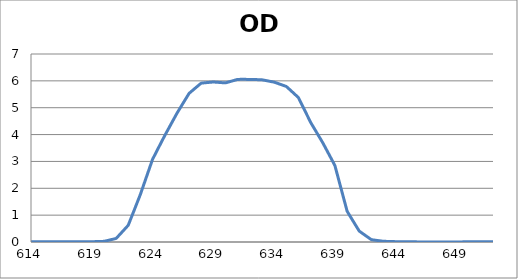
| Category | Series 0 |
|---|---|
| 2600.0 | 0.269 |
| 2599.0 | 0.268 |
| 2598.0 | 0.267 |
| 2597.0 | 0.266 |
| 2596.0 | 0.264 |
| 2595.0 | 0.263 |
| 2594.0 | 0.261 |
| 2593.0 | 0.259 |
| 2592.0 | 0.257 |
| 2591.0 | 0.255 |
| 2590.0 | 0.253 |
| 2589.0 | 0.251 |
| 2588.0 | 0.249 |
| 2587.0 | 0.247 |
| 2586.0 | 0.246 |
| 2585.0 | 0.244 |
| 2584.0 | 0.243 |
| 2583.0 | 0.242 |
| 2582.0 | 0.241 |
| 2581.0 | 0.24 |
| 2580.0 | 0.239 |
| 2579.0 | 0.238 |
| 2578.0 | 0.238 |
| 2577.0 | 0.237 |
| 2576.0 | 0.237 |
| 2575.0 | 0.237 |
| 2574.0 | 0.236 |
| 2573.0 | 0.236 |
| 2572.0 | 0.237 |
| 2571.0 | 0.237 |
| 2570.0 | 0.237 |
| 2569.0 | 0.238 |
| 2568.0 | 0.238 |
| 2567.0 | 0.238 |
| 2566.0 | 0.239 |
| 2565.0 | 0.239 |
| 2564.0 | 0.239 |
| 2563.0 | 0.24 |
| 2562.0 | 0.24 |
| 2561.0 | 0.24 |
| 2560.0 | 0.24 |
| 2559.0 | 0.24 |
| 2558.0 | 0.24 |
| 2557.0 | 0.239 |
| 2556.0 | 0.238 |
| 2555.0 | 0.237 |
| 2554.0 | 0.236 |
| 2553.0 | 0.235 |
| 2552.0 | 0.233 |
| 2551.0 | 0.231 |
| 2550.0 | 0.229 |
| 2549.0 | 0.226 |
| 2548.0 | 0.223 |
| 2547.0 | 0.22 |
| 2546.0 | 0.217 |
| 2545.0 | 0.213 |
| 2544.0 | 0.21 |
| 2543.0 | 0.206 |
| 2542.0 | 0.203 |
| 2541.0 | 0.2 |
| 2540.0 | 0.196 |
| 2539.0 | 0.192 |
| 2538.0 | 0.189 |
| 2537.0 | 0.185 |
| 2536.0 | 0.182 |
| 2535.0 | 0.179 |
| 2534.0 | 0.175 |
| 2533.0 | 0.172 |
| 2532.0 | 0.169 |
| 2531.0 | 0.167 |
| 2530.0 | 0.164 |
| 2529.0 | 0.163 |
| 2528.0 | 0.161 |
| 2527.0 | 0.16 |
| 2526.0 | 0.159 |
| 2525.0 | 0.159 |
| 2524.0 | 0.159 |
| 2523.0 | 0.16 |
| 2522.0 | 0.161 |
| 2521.0 | 0.162 |
| 2520.0 | 0.164 |
| 2519.0 | 0.166 |
| 2518.0 | 0.168 |
| 2517.0 | 0.171 |
| 2516.0 | 0.174 |
| 2515.0 | 0.178 |
| 2514.0 | 0.181 |
| 2513.0 | 0.185 |
| 2512.0 | 0.189 |
| 2511.0 | 0.192 |
| 2510.0 | 0.196 |
| 2509.0 | 0.2 |
| 2508.0 | 0.204 |
| 2507.0 | 0.207 |
| 2506.0 | 0.211 |
| 2505.0 | 0.214 |
| 2504.0 | 0.217 |
| 2503.0 | 0.22 |
| 2502.0 | 0.222 |
| 2501.0 | 0.224 |
| 2500.0 | 0.226 |
| 2499.0 | 0.227 |
| 2498.0 | 0.228 |
| 2497.0 | 0.228 |
| 2496.0 | 0.228 |
| 2495.0 | 0.227 |
| 2494.0 | 0.226 |
| 2493.0 | 0.225 |
| 2492.0 | 0.223 |
| 2491.0 | 0.221 |
| 2490.0 | 0.219 |
| 2489.0 | 0.216 |
| 2488.0 | 0.212 |
| 2487.0 | 0.209 |
| 2486.0 | 0.205 |
| 2485.0 | 0.201 |
| 2484.0 | 0.197 |
| 2483.0 | 0.192 |
| 2482.0 | 0.187 |
| 2481.0 | 0.183 |
| 2480.0 | 0.178 |
| 2479.0 | 0.173 |
| 2478.0 | 0.169 |
| 2477.0 | 0.165 |
| 2476.0 | 0.16 |
| 2475.0 | 0.156 |
| 2474.0 | 0.153 |
| 2473.0 | 0.149 |
| 2472.0 | 0.146 |
| 2471.0 | 0.143 |
| 2470.0 | 0.141 |
| 2469.0 | 0.14 |
| 2468.0 | 0.139 |
| 2467.0 | 0.138 |
| 2466.0 | 0.138 |
| 2465.0 | 0.138 |
| 2464.0 | 0.139 |
| 2463.0 | 0.14 |
| 2462.0 | 0.142 |
| 2461.0 | 0.143 |
| 2460.0 | 0.146 |
| 2459.0 | 0.148 |
| 2458.0 | 0.151 |
| 2457.0 | 0.153 |
| 2456.0 | 0.156 |
| 2455.0 | 0.159 |
| 2454.0 | 0.162 |
| 2453.0 | 0.165 |
| 2452.0 | 0.168 |
| 2451.0 | 0.17 |
| 2450.0 | 0.172 |
| 2449.0 | 0.175 |
| 2448.0 | 0.177 |
| 2447.0 | 0.178 |
| 2446.0 | 0.18 |
| 2445.0 | 0.18 |
| 2444.0 | 0.181 |
| 2443.0 | 0.181 |
| 2442.0 | 0.181 |
| 2441.0 | 0.18 |
| 2440.0 | 0.179 |
| 2439.0 | 0.178 |
| 2438.0 | 0.176 |
| 2437.0 | 0.174 |
| 2436.0 | 0.172 |
| 2435.0 | 0.169 |
| 2434.0 | 0.166 |
| 2433.0 | 0.163 |
| 2432.0 | 0.16 |
| 2431.0 | 0.156 |
| 2430.0 | 0.153 |
| 2429.0 | 0.149 |
| 2428.0 | 0.146 |
| 2427.0 | 0.142 |
| 2426.0 | 0.139 |
| 2425.0 | 0.136 |
| 2424.0 | 0.133 |
| 2423.0 | 0.131 |
| 2422.0 | 0.129 |
| 2421.0 | 0.127 |
| 2420.0 | 0.126 |
| 2419.0 | 0.125 |
| 2418.0 | 0.124 |
| 2417.0 | 0.124 |
| 2416.0 | 0.125 |
| 2415.0 | 0.126 |
| 2414.0 | 0.128 |
| 2413.0 | 0.129 |
| 2412.0 | 0.131 |
| 2411.0 | 0.133 |
| 2410.0 | 0.136 |
| 2409.0 | 0.139 |
| 2408.0 | 0.142 |
| 2407.0 | 0.145 |
| 2406.0 | 0.149 |
| 2405.0 | 0.152 |
| 2404.0 | 0.155 |
| 2403.0 | 0.159 |
| 2402.0 | 0.162 |
| 2401.0 | 0.165 |
| 2400.0 | 0.168 |
| 2399.0 | 0.171 |
| 2398.0 | 0.173 |
| 2397.0 | 0.175 |
| 2396.0 | 0.177 |
| 2395.0 | 0.178 |
| 2394.0 | 0.18 |
| 2393.0 | 0.18 |
| 2392.0 | 0.181 |
| 2391.0 | 0.18 |
| 2390.0 | 0.18 |
| 2389.0 | 0.18 |
| 2388.0 | 0.179 |
| 2387.0 | 0.178 |
| 2386.0 | 0.177 |
| 2385.0 | 0.175 |
| 2384.0 | 0.173 |
| 2383.0 | 0.172 |
| 2382.0 | 0.17 |
| 2381.0 | 0.169 |
| 2380.0 | 0.167 |
| 2379.0 | 0.166 |
| 2378.0 | 0.165 |
| 2377.0 | 0.164 |
| 2376.0 | 0.164 |
| 2375.0 | 0.164 |
| 2374.0 | 0.164 |
| 2373.0 | 0.165 |
| 2372.0 | 0.166 |
| 2371.0 | 0.168 |
| 2370.0 | 0.17 |
| 2369.0 | 0.173 |
| 2368.0 | 0.176 |
| 2367.0 | 0.179 |
| 2366.0 | 0.183 |
| 2365.0 | 0.188 |
| 2364.0 | 0.192 |
| 2363.0 | 0.197 |
| 2362.0 | 0.203 |
| 2361.0 | 0.208 |
| 2360.0 | 0.213 |
| 2359.0 | 0.219 |
| 2358.0 | 0.224 |
| 2357.0 | 0.23 |
| 2356.0 | 0.235 |
| 2355.0 | 0.24 |
| 2354.0 | 0.245 |
| 2353.0 | 0.249 |
| 2352.0 | 0.253 |
| 2351.0 | 0.256 |
| 2350.0 | 0.259 |
| 2349.0 | 0.262 |
| 2348.0 | 0.264 |
| 2347.0 | 0.265 |
| 2346.0 | 0.266 |
| 2345.0 | 0.266 |
| 2344.0 | 0.265 |
| 2343.0 | 0.264 |
| 2342.0 | 0.262 |
| 2341.0 | 0.26 |
| 2340.0 | 0.257 |
| 2339.0 | 0.253 |
| 2338.0 | 0.249 |
| 2337.0 | 0.245 |
| 2336.0 | 0.24 |
| 2335.0 | 0.235 |
| 2334.0 | 0.229 |
| 2333.0 | 0.224 |
| 2332.0 | 0.218 |
| 2331.0 | 0.212 |
| 2330.0 | 0.206 |
| 2329.0 | 0.2 |
| 2328.0 | 0.194 |
| 2327.0 | 0.188 |
| 2326.0 | 0.183 |
| 2325.0 | 0.178 |
| 2324.0 | 0.173 |
| 2323.0 | 0.169 |
| 2322.0 | 0.165 |
| 2321.0 | 0.162 |
| 2320.0 | 0.159 |
| 2319.0 | 0.158 |
| 2318.0 | 0.156 |
| 2317.0 | 0.156 |
| 2316.0 | 0.156 |
| 2315.0 | 0.157 |
| 2314.0 | 0.158 |
| 2313.0 | 0.16 |
| 2312.0 | 0.163 |
| 2311.0 | 0.166 |
| 2310.0 | 0.169 |
| 2309.0 | 0.173 |
| 2308.0 | 0.177 |
| 2307.0 | 0.181 |
| 2306.0 | 0.185 |
| 2305.0 | 0.189 |
| 2304.0 | 0.193 |
| 2303.0 | 0.197 |
| 2302.0 | 0.2 |
| 2301.0 | 0.203 |
| 2300.0 | 0.206 |
| 2299.0 | 0.209 |
| 2298.0 | 0.211 |
| 2297.0 | 0.213 |
| 2296.0 | 0.214 |
| 2295.0 | 0.215 |
| 2294.0 | 0.215 |
| 2293.0 | 0.216 |
| 2292.0 | 0.215 |
| 2291.0 | 0.214 |
| 2290.0 | 0.213 |
| 2289.0 | 0.212 |
| 2288.0 | 0.21 |
| 2287.0 | 0.208 |
| 2286.0 | 0.205 |
| 2285.0 | 0.202 |
| 2284.0 | 0.199 |
| 2283.0 | 0.196 |
| 2282.0 | 0.193 |
| 2281.0 | 0.189 |
| 2280.0 | 0.186 |
| 2279.0 | 0.182 |
| 2278.0 | 0.179 |
| 2277.0 | 0.175 |
| 2276.0 | 0.172 |
| 2275.0 | 0.169 |
| 2274.0 | 0.166 |
| 2273.0 | 0.162 |
| 2272.0 | 0.159 |
| 2271.0 | 0.157 |
| 2270.0 | 0.154 |
| 2269.0 | 0.152 |
| 2268.0 | 0.15 |
| 2267.0 | 0.148 |
| 2266.0 | 0.146 |
| 2265.0 | 0.144 |
| 2264.0 | 0.142 |
| 2263.0 | 0.14 |
| 2262.0 | 0.139 |
| 2261.0 | 0.138 |
| 2260.0 | 0.136 |
| 2259.0 | 0.135 |
| 2258.0 | 0.133 |
| 2257.0 | 0.132 |
| 2256.0 | 0.131 |
| 2255.0 | 0.13 |
| 2254.0 | 0.129 |
| 2253.0 | 0.128 |
| 2252.0 | 0.128 |
| 2251.0 | 0.127 |
| 2250.0 | 0.127 |
| 2249.0 | 0.127 |
| 2248.0 | 0.127 |
| 2247.0 | 0.128 |
| 2246.0 | 0.129 |
| 2245.0 | 0.13 |
| 2244.0 | 0.132 |
| 2243.0 | 0.134 |
| 2242.0 | 0.137 |
| 2241.0 | 0.14 |
| 2240.0 | 0.144 |
| 2239.0 | 0.148 |
| 2238.0 | 0.153 |
| 2237.0 | 0.159 |
| 2236.0 | 0.164 |
| 2235.0 | 0.171 |
| 2234.0 | 0.177 |
| 2233.0 | 0.184 |
| 2232.0 | 0.191 |
| 2231.0 | 0.197 |
| 2230.0 | 0.204 |
| 2229.0 | 0.211 |
| 2228.0 | 0.218 |
| 2227.0 | 0.225 |
| 2226.0 | 0.231 |
| 2225.0 | 0.237 |
| 2224.0 | 0.243 |
| 2223.0 | 0.248 |
| 2222.0 | 0.252 |
| 2221.0 | 0.256 |
| 2220.0 | 0.259 |
| 2219.0 | 0.261 |
| 2218.0 | 0.262 |
| 2217.0 | 0.263 |
| 2216.0 | 0.263 |
| 2215.0 | 0.261 |
| 2214.0 | 0.26 |
| 2213.0 | 0.257 |
| 2212.0 | 0.253 |
| 2211.0 | 0.247 |
| 2210.0 | 0.242 |
| 2209.0 | 0.235 |
| 2208.0 | 0.227 |
| 2207.0 | 0.218 |
| 2206.0 | 0.209 |
| 2205.0 | 0.2 |
| 2204.0 | 0.189 |
| 2203.0 | 0.179 |
| 2202.0 | 0.169 |
| 2201.0 | 0.159 |
| 2200.0 | 0.149 |
| 2199.0 | 0.14 |
| 2198.0 | 0.131 |
| 2197.0 | 0.123 |
| 2196.0 | 0.117 |
| 2195.0 | 0.111 |
| 2194.0 | 0.108 |
| 2193.0 | 0.104 |
| 2192.0 | 0.103 |
| 2191.0 | 0.102 |
| 2190.0 | 0.103 |
| 2189.0 | 0.104 |
| 2188.0 | 0.107 |
| 2187.0 | 0.11 |
| 2186.0 | 0.113 |
| 2185.0 | 0.117 |
| 2184.0 | 0.122 |
| 2183.0 | 0.126 |
| 2182.0 | 0.131 |
| 2181.0 | 0.135 |
| 2180.0 | 0.139 |
| 2179.0 | 0.143 |
| 2178.0 | 0.146 |
| 2177.0 | 0.149 |
| 2176.0 | 0.151 |
| 2175.0 | 0.152 |
| 2174.0 | 0.153 |
| 2173.0 | 0.153 |
| 2172.0 | 0.152 |
| 2171.0 | 0.151 |
| 2170.0 | 0.149 |
| 2169.0 | 0.146 |
| 2168.0 | 0.142 |
| 2167.0 | 0.139 |
| 2166.0 | 0.134 |
| 2165.0 | 0.129 |
| 2164.0 | 0.124 |
| 2163.0 | 0.118 |
| 2162.0 | 0.112 |
| 2161.0 | 0.107 |
| 2160.0 | 0.101 |
| 2159.0 | 0.095 |
| 2158.0 | 0.09 |
| 2157.0 | 0.085 |
| 2156.0 | 0.081 |
| 2155.0 | 0.078 |
| 2154.0 | 0.075 |
| 2153.0 | 0.073 |
| 2152.0 | 0.072 |
| 2151.0 | 0.072 |
| 2150.0 | 0.073 |
| 2149.0 | 0.074 |
| 2148.0 | 0.076 |
| 2147.0 | 0.079 |
| 2146.0 | 0.082 |
| 2145.0 | 0.086 |
| 2144.0 | 0.09 |
| 2143.0 | 0.095 |
| 2142.0 | 0.099 |
| 2141.0 | 0.104 |
| 2140.0 | 0.108 |
| 2139.0 | 0.112 |
| 2138.0 | 0.115 |
| 2137.0 | 0.119 |
| 2136.0 | 0.121 |
| 2135.0 | 0.124 |
| 2134.0 | 0.125 |
| 2133.0 | 0.126 |
| 2132.0 | 0.127 |
| 2131.0 | 0.127 |
| 2130.0 | 0.126 |
| 2129.0 | 0.125 |
| 2128.0 | 0.123 |
| 2127.0 | 0.121 |
| 2126.0 | 0.119 |
| 2125.0 | 0.116 |
| 2124.0 | 0.112 |
| 2123.0 | 0.109 |
| 2122.0 | 0.105 |
| 2121.0 | 0.102 |
| 2120.0 | 0.099 |
| 2119.0 | 0.095 |
| 2118.0 | 0.092 |
| 2117.0 | 0.09 |
| 2116.0 | 0.088 |
| 2115.0 | 0.087 |
| 2114.0 | 0.086 |
| 2113.0 | 0.086 |
| 2112.0 | 0.086 |
| 2111.0 | 0.088 |
| 2110.0 | 0.089 |
| 2109.0 | 0.092 |
| 2108.0 | 0.094 |
| 2107.0 | 0.098 |
| 2106.0 | 0.101 |
| 2105.0 | 0.105 |
| 2104.0 | 0.108 |
| 2103.0 | 0.112 |
| 2102.0 | 0.116 |
| 2101.0 | 0.119 |
| 2100.0 | 0.122 |
| 2099.0 | 0.125 |
| 2098.0 | 0.127 |
| 2097.0 | 0.129 |
| 2096.0 | 0.131 |
| 2095.0 | 0.132 |
| 2094.0 | 0.132 |
| 2093.0 | 0.132 |
| 2092.0 | 0.132 |
| 2091.0 | 0.13 |
| 2090.0 | 0.129 |
| 2089.0 | 0.127 |
| 2088.0 | 0.125 |
| 2087.0 | 0.122 |
| 2086.0 | 0.119 |
| 2085.0 | 0.115 |
| 2084.0 | 0.112 |
| 2083.0 | 0.108 |
| 2082.0 | 0.104 |
| 2081.0 | 0.101 |
| 2080.0 | 0.097 |
| 2079.0 | 0.094 |
| 2078.0 | 0.091 |
| 2077.0 | 0.088 |
| 2076.0 | 0.085 |
| 2075.0 | 0.083 |
| 2074.0 | 0.081 |
| 2073.0 | 0.08 |
| 2072.0 | 0.079 |
| 2071.0 | 0.078 |
| 2070.0 | 0.078 |
| 2069.0 | 0.078 |
| 2068.0 | 0.078 |
| 2067.0 | 0.078 |
| 2066.0 | 0.078 |
| 2065.0 | 0.078 |
| 2064.0 | 0.078 |
| 2063.0 | 0.078 |
| 2062.0 | 0.079 |
| 2061.0 | 0.078 |
| 2060.0 | 0.078 |
| 2059.0 | 0.077 |
| 2058.0 | 0.077 |
| 2057.0 | 0.076 |
| 2056.0 | 0.075 |
| 2055.0 | 0.073 |
| 2054.0 | 0.072 |
| 2053.0 | 0.07 |
| 2052.0 | 0.069 |
| 2051.0 | 0.067 |
| 2050.0 | 0.066 |
| 2049.0 | 0.064 |
| 2048.0 | 0.063 |
| 2047.0 | 0.061 |
| 2046.0 | 0.06 |
| 2045.0 | 0.059 |
| 2044.0 | 0.059 |
| 2043.0 | 0.058 |
| 2042.0 | 0.058 |
| 2041.0 | 0.058 |
| 2040.0 | 0.058 |
| 2039.0 | 0.059 |
| 2038.0 | 0.06 |
| 2037.0 | 0.061 |
| 2036.0 | 0.062 |
| 2035.0 | 0.063 |
| 2034.0 | 0.064 |
| 2033.0 | 0.065 |
| 2032.0 | 0.066 |
| 2031.0 | 0.067 |
| 2030.0 | 0.068 |
| 2029.0 | 0.068 |
| 2028.0 | 0.068 |
| 2027.0 | 0.069 |
| 2026.0 | 0.068 |
| 2025.0 | 0.068 |
| 2024.0 | 0.068 |
| 2023.0 | 0.067 |
| 2022.0 | 0.067 |
| 2021.0 | 0.066 |
| 2020.0 | 0.065 |
| 2019.0 | 0.065 |
| 2018.0 | 0.065 |
| 2017.0 | 0.064 |
| 2016.0 | 0.065 |
| 2015.0 | 0.065 |
| 2014.0 | 0.066 |
| 2013.0 | 0.067 |
| 2012.0 | 0.068 |
| 2011.0 | 0.07 |
| 2010.0 | 0.072 |
| 2009.0 | 0.074 |
| 2008.0 | 0.077 |
| 2007.0 | 0.08 |
| 2006.0 | 0.083 |
| 2005.0 | 0.086 |
| 2004.0 | 0.089 |
| 2003.0 | 0.092 |
| 2002.0 | 0.094 |
| 2001.0 | 0.097 |
| 2000.0 | 0.099 |
| 1999.0 | 0.101 |
| 1998.0 | 0.102 |
| 1997.0 | 0.103 |
| 1996.0 | 0.103 |
| 1995.0 | 0.103 |
| 1994.0 | 0.102 |
| 1993.0 | 0.1 |
| 1992.0 | 0.098 |
| 1991.0 | 0.095 |
| 1990.0 | 0.092 |
| 1989.0 | 0.089 |
| 1988.0 | 0.085 |
| 1987.0 | 0.082 |
| 1986.0 | 0.078 |
| 1985.0 | 0.074 |
| 1984.0 | 0.071 |
| 1983.0 | 0.067 |
| 1982.0 | 0.065 |
| 1981.0 | 0.063 |
| 1980.0 | 0.061 |
| 1979.0 | 0.06 |
| 1978.0 | 0.06 |
| 1977.0 | 0.06 |
| 1976.0 | 0.061 |
| 1975.0 | 0.063 |
| 1974.0 | 0.065 |
| 1973.0 | 0.068 |
| 1972.0 | 0.071 |
| 1971.0 | 0.074 |
| 1970.0 | 0.077 |
| 1969.0 | 0.08 |
| 1968.0 | 0.083 |
| 1967.0 | 0.086 |
| 1966.0 | 0.089 |
| 1965.0 | 0.091 |
| 1964.0 | 0.092 |
| 1963.0 | 0.093 |
| 1962.0 | 0.094 |
| 1961.0 | 0.093 |
| 1960.0 | 0.092 |
| 1959.0 | 0.09 |
| 1958.0 | 0.088 |
| 1957.0 | 0.084 |
| 1956.0 | 0.081 |
| 1955.0 | 0.077 |
| 1954.0 | 0.072 |
| 1953.0 | 0.067 |
| 1952.0 | 0.063 |
| 1951.0 | 0.058 |
| 1950.0 | 0.053 |
| 1949.0 | 0.049 |
| 1948.0 | 0.046 |
| 1947.0 | 0.043 |
| 1946.0 | 0.04 |
| 1945.0 | 0.039 |
| 1944.0 | 0.038 |
| 1943.0 | 0.038 |
| 1942.0 | 0.038 |
| 1941.0 | 0.039 |
| 1940.0 | 0.041 |
| 1939.0 | 0.043 |
| 1938.0 | 0.045 |
| 1937.0 | 0.048 |
| 1936.0 | 0.05 |
| 1935.0 | 0.052 |
| 1934.0 | 0.054 |
| 1933.0 | 0.056 |
| 1932.0 | 0.058 |
| 1931.0 | 0.059 |
| 1930.0 | 0.059 |
| 1929.0 | 0.059 |
| 1928.0 | 0.059 |
| 1927.0 | 0.058 |
| 1926.0 | 0.057 |
| 1925.0 | 0.055 |
| 1924.0 | 0.053 |
| 1923.0 | 0.051 |
| 1922.0 | 0.049 |
| 1921.0 | 0.047 |
| 1920.0 | 0.046 |
| 1919.0 | 0.045 |
| 1918.0 | 0.045 |
| 1917.0 | 0.045 |
| 1916.0 | 0.045 |
| 1915.0 | 0.047 |
| 1914.0 | 0.049 |
| 1913.0 | 0.053 |
| 1912.0 | 0.057 |
| 1911.0 | 0.061 |
| 1910.0 | 0.066 |
| 1909.0 | 0.07 |
| 1908.0 | 0.074 |
| 1907.0 | 0.079 |
| 1906.0 | 0.084 |
| 1905.0 | 0.089 |
| 1904.0 | 0.093 |
| 1903.0 | 0.096 |
| 1902.0 | 0.099 |
| 1901.0 | 0.1 |
| 1900.0 | 0.101 |
| 1899.0 | 0.101 |
| 1898.0 | 0.1 |
| 1897.0 | 0.098 |
| 1896.0 | 0.096 |
| 1895.0 | 0.093 |
| 1894.0 | 0.089 |
| 1893.0 | 0.085 |
| 1892.0 | 0.08 |
| 1891.0 | 0.076 |
| 1890.0 | 0.072 |
| 1889.0 | 0.068 |
| 1888.0 | 0.064 |
| 1887.0 | 0.061 |
| 1886.0 | 0.058 |
| 1885.0 | 0.057 |
| 1884.0 | 0.056 |
| 1883.0 | 0.056 |
| 1882.0 | 0.057 |
| 1881.0 | 0.059 |
| 1880.0 | 0.062 |
| 1879.0 | 0.065 |
| 1878.0 | 0.069 |
| 1877.0 | 0.073 |
| 1876.0 | 0.077 |
| 1875.0 | 0.081 |
| 1874.0 | 0.085 |
| 1873.0 | 0.089 |
| 1872.0 | 0.092 |
| 1871.0 | 0.094 |
| 1870.0 | 0.095 |
| 1869.0 | 0.096 |
| 1868.0 | 0.095 |
| 1867.0 | 0.094 |
| 1866.0 | 0.092 |
| 1865.0 | 0.089 |
| 1864.0 | 0.086 |
| 1863.0 | 0.082 |
| 1862.0 | 0.079 |
| 1861.0 | 0.075 |
| 1860.0 | 0.071 |
| 1859.0 | 0.068 |
| 1858.0 | 0.065 |
| 1857.0 | 0.063 |
| 1856.0 | 0.061 |
| 1855.0 | 0.061 |
| 1854.0 | 0.061 |
| 1853.0 | 0.062 |
| 1852.0 | 0.064 |
| 1851.0 | 0.066 |
| 1850.0 | 0.068 |
| 1849.0 | 0.071 |
| 1848.0 | 0.075 |
| 1847.0 | 0.08 |
| 1846.0 | 0.084 |
| 1845.0 | 0.087 |
| 1844.0 | 0.09 |
| 1843.0 | 0.091 |
| 1842.0 | 0.092 |
| 1841.0 | 0.093 |
| 1840.0 | 0.092 |
| 1839.0 | 0.091 |
| 1838.0 | 0.089 |
| 1837.0 | 0.086 |
| 1836.0 | 0.081 |
| 1835.0 | 0.075 |
| 1834.0 | 0.07 |
| 1833.0 | 0.064 |
| 1832.0 | 0.059 |
| 1831.0 | 0.053 |
| 1830.0 | 0.047 |
| 1829.0 | 0.041 |
| 1828.0 | 0.037 |
| 1827.0 | 0.034 |
| 1826.0 | 0.031 |
| 1825.0 | 0.029 |
| 1824.0 | 0.029 |
| 1823.0 | 0.029 |
| 1822.0 | 0.03 |
| 1821.0 | 0.032 |
| 1820.0 | 0.035 |
| 1819.0 | 0.038 |
| 1818.0 | 0.041 |
| 1817.0 | 0.043 |
| 1816.0 | 0.046 |
| 1815.0 | 0.048 |
| 1814.0 | 0.05 |
| 1813.0 | 0.051 |
| 1812.0 | 0.052 |
| 1811.0 | 0.051 |
| 1810.0 | 0.05 |
| 1809.0 | 0.049 |
| 1808.0 | 0.047 |
| 1807.0 | 0.045 |
| 1806.0 | 0.042 |
| 1805.0 | 0.04 |
| 1804.0 | 0.037 |
| 1803.0 | 0.035 |
| 1802.0 | 0.033 |
| 1801.0 | 0.032 |
| 1800.0 | 0.032 |
| 1799.0 | 0.032 |
| 1798.0 | 0.033 |
| 1797.0 | 0.036 |
| 1796.0 | 0.039 |
| 1795.0 | 0.042 |
| 1794.0 | 0.047 |
| 1793.0 | 0.051 |
| 1792.0 | 0.055 |
| 1791.0 | 0.06 |
| 1790.0 | 0.064 |
| 1789.0 | 0.067 |
| 1788.0 | 0.07 |
| 1787.0 | 0.073 |
| 1786.0 | 0.074 |
| 1785.0 | 0.075 |
| 1784.0 | 0.075 |
| 1783.0 | 0.074 |
| 1782.0 | 0.073 |
| 1781.0 | 0.071 |
| 1780.0 | 0.07 |
| 1779.0 | 0.068 |
| 1778.0 | 0.066 |
| 1777.0 | 0.065 |
| 1776.0 | 0.064 |
| 1775.0 | 0.064 |
| 1774.0 | 0.065 |
| 1773.0 | 0.066 |
| 1772.0 | 0.068 |
| 1771.0 | 0.071 |
| 1770.0 | 0.074 |
| 1769.0 | 0.078 |
| 1768.0 | 0.082 |
| 1767.0 | 0.086 |
| 1766.0 | 0.09 |
| 1765.0 | 0.094 |
| 1764.0 | 0.097 |
| 1763.0 | 0.099 |
| 1762.0 | 0.101 |
| 1761.0 | 0.102 |
| 1760.0 | 0.101 |
| 1759.0 | 0.099 |
| 1758.0 | 0.097 |
| 1757.0 | 0.094 |
| 1756.0 | 0.09 |
| 1755.0 | 0.085 |
| 1754.0 | 0.081 |
| 1753.0 | 0.076 |
| 1752.0 | 0.072 |
| 1751.0 | 0.069 |
| 1750.0 | 0.067 |
| 1749.0 | 0.066 |
| 1748.0 | 0.066 |
| 1747.0 | 0.068 |
| 1746.0 | 0.071 |
| 1745.0 | 0.075 |
| 1744.0 | 0.081 |
| 1743.0 | 0.087 |
| 1742.0 | 0.094 |
| 1741.0 | 0.101 |
| 1740.0 | 0.107 |
| 1739.0 | 0.113 |
| 1738.0 | 0.118 |
| 1737.0 | 0.121 |
| 1736.0 | 0.124 |
| 1735.0 | 0.125 |
| 1734.0 | 0.125 |
| 1733.0 | 0.122 |
| 1732.0 | 0.119 |
| 1731.0 | 0.114 |
| 1730.0 | 0.108 |
| 1729.0 | 0.101 |
| 1728.0 | 0.093 |
| 1727.0 | 0.084 |
| 1726.0 | 0.076 |
| 1725.0 | 0.068 |
| 1724.0 | 0.061 |
| 1723.0 | 0.054 |
| 1722.0 | 0.049 |
| 1721.0 | 0.046 |
| 1720.0 | 0.044 |
| 1719.0 | 0.044 |
| 1718.0 | 0.046 |
| 1717.0 | 0.049 |
| 1716.0 | 0.052 |
| 1715.0 | 0.057 |
| 1714.0 | 0.061 |
| 1713.0 | 0.066 |
| 1712.0 | 0.07 |
| 1711.0 | 0.073 |
| 1710.0 | 0.075 |
| 1709.0 | 0.076 |
| 1708.0 | 0.076 |
| 1707.0 | 0.075 |
| 1706.0 | 0.073 |
| 1705.0 | 0.07 |
| 1704.0 | 0.066 |
| 1703.0 | 0.062 |
| 1702.0 | 0.058 |
| 1701.0 | 0.055 |
| 1700.0 | 0.052 |
| 1699.0 | 0.05 |
| 1698.0 | 0.05 |
| 1697.0 | 0.05 |
| 1696.0 | 0.053 |
| 1695.0 | 0.056 |
| 1694.0 | 0.06 |
| 1693.0 | 0.065 |
| 1692.0 | 0.07 |
| 1691.0 | 0.076 |
| 1690.0 | 0.082 |
| 1689.0 | 0.087 |
| 1688.0 | 0.092 |
| 1687.0 | 0.096 |
| 1686.0 | 0.099 |
| 1685.0 | 0.101 |
| 1684.0 | 0.103 |
| 1683.0 | 0.103 |
| 1682.0 | 0.103 |
| 1681.0 | 0.102 |
| 1680.0 | 0.102 |
| 1679.0 | 0.101 |
| 1678.0 | 0.102 |
| 1677.0 | 0.103 |
| 1676.0 | 0.105 |
| 1675.0 | 0.109 |
| 1674.0 | 0.114 |
| 1673.0 | 0.121 |
| 1672.0 | 0.128 |
| 1671.0 | 0.137 |
| 1670.0 | 0.146 |
| 1669.0 | 0.155 |
| 1668.0 | 0.164 |
| 1667.0 | 0.172 |
| 1666.0 | 0.179 |
| 1665.0 | 0.184 |
| 1664.0 | 0.188 |
| 1663.0 | 0.19 |
| 1662.0 | 0.19 |
| 1661.0 | 0.188 |
| 1660.0 | 0.186 |
| 1659.0 | 0.182 |
| 1658.0 | 0.178 |
| 1657.0 | 0.174 |
| 1656.0 | 0.17 |
| 1655.0 | 0.167 |
| 1654.0 | 0.165 |
| 1653.0 | 0.166 |
| 1652.0 | 0.169 |
| 1651.0 | 0.174 |
| 1650.0 | 0.181 |
| 1649.0 | 0.191 |
| 1648.0 | 0.202 |
| 1647.0 | 0.214 |
| 1646.0 | 0.228 |
| 1645.0 | 0.241 |
| 1644.0 | 0.254 |
| 1643.0 | 0.267 |
| 1642.0 | 0.277 |
| 1641.0 | 0.286 |
| 1640.0 | 0.292 |
| 1639.0 | 0.295 |
| 1638.0 | 0.296 |
| 1637.0 | 0.294 |
| 1636.0 | 0.288 |
| 1635.0 | 0.281 |
| 1634.0 | 0.271 |
| 1633.0 | 0.26 |
| 1632.0 | 0.248 |
| 1631.0 | 0.235 |
| 1630.0 | 0.223 |
| 1629.0 | 0.212 |
| 1628.0 | 0.202 |
| 1627.0 | 0.196 |
| 1626.0 | 0.192 |
| 1625.0 | 0.19 |
| 1624.0 | 0.192 |
| 1623.0 | 0.196 |
| 1622.0 | 0.202 |
| 1621.0 | 0.209 |
| 1620.0 | 0.216 |
| 1619.0 | 0.224 |
| 1618.0 | 0.23 |
| 1617.0 | 0.235 |
| 1616.0 | 0.239 |
| 1615.0 | 0.24 |
| 1614.0 | 0.24 |
| 1613.0 | 0.237 |
| 1612.0 | 0.232 |
| 1611.0 | 0.225 |
| 1610.0 | 0.217 |
| 1609.0 | 0.208 |
| 1608.0 | 0.199 |
| 1607.0 | 0.19 |
| 1606.0 | 0.181 |
| 1605.0 | 0.173 |
| 1604.0 | 0.167 |
| 1603.0 | 0.164 |
| 1602.0 | 0.162 |
| 1601.0 | 0.162 |
| 1600.0 | 0.164 |
| 1599.0 | 0.167 |
| 1598.0 | 0.171 |
| 1597.0 | 0.175 |
| 1596.0 | 0.179 |
| 1595.0 | 0.182 |
| 1594.0 | 0.183 |
| 1593.0 | 0.183 |
| 1592.0 | 0.182 |
| 1591.0 | 0.178 |
| 1590.0 | 0.173 |
| 1589.0 | 0.168 |
| 1588.0 | 0.161 |
| 1587.0 | 0.154 |
| 1586.0 | 0.148 |
| 1585.0 | 0.143 |
| 1584.0 | 0.14 |
| 1583.0 | 0.138 |
| 1582.0 | 0.138 |
| 1581.0 | 0.14 |
| 1580.0 | 0.143 |
| 1579.0 | 0.148 |
| 1578.0 | 0.153 |
| 1577.0 | 0.159 |
| 1576.0 | 0.164 |
| 1575.0 | 0.169 |
| 1574.0 | 0.173 |
| 1573.0 | 0.175 |
| 1572.0 | 0.176 |
| 1571.0 | 0.175 |
| 1570.0 | 0.172 |
| 1569.0 | 0.168 |
| 1568.0 | 0.164 |
| 1567.0 | 0.159 |
| 1566.0 | 0.155 |
| 1565.0 | 0.151 |
| 1564.0 | 0.149 |
| 1563.0 | 0.149 |
| 1562.0 | 0.151 |
| 1561.0 | 0.156 |
| 1560.0 | 0.163 |
| 1559.0 | 0.172 |
| 1558.0 | 0.182 |
| 1557.0 | 0.192 |
| 1556.0 | 0.203 |
| 1555.0 | 0.213 |
| 1554.0 | 0.222 |
| 1553.0 | 0.229 |
| 1552.0 | 0.233 |
| 1551.0 | 0.236 |
| 1550.0 | 0.235 |
| 1549.0 | 0.233 |
| 1548.0 | 0.229 |
| 1547.0 | 0.223 |
| 1546.0 | 0.216 |
| 1545.0 | 0.208 |
| 1544.0 | 0.202 |
| 1543.0 | 0.196 |
| 1542.0 | 0.193 |
| 1541.0 | 0.191 |
| 1540.0 | 0.191 |
| 1539.0 | 0.193 |
| 1538.0 | 0.197 |
| 1537.0 | 0.203 |
| 1536.0 | 0.21 |
| 1535.0 | 0.217 |
| 1534.0 | 0.224 |
| 1533.0 | 0.23 |
| 1532.0 | 0.235 |
| 1531.0 | 0.239 |
| 1530.0 | 0.241 |
| 1529.0 | 0.241 |
| 1528.0 | 0.24 |
| 1527.0 | 0.236 |
| 1526.0 | 0.232 |
| 1525.0 | 0.226 |
| 1524.0 | 0.219 |
| 1523.0 | 0.213 |
| 1522.0 | 0.206 |
| 1521.0 | 0.2 |
| 1520.0 | 0.195 |
| 1519.0 | 0.191 |
| 1518.0 | 0.188 |
| 1517.0 | 0.186 |
| 1516.0 | 0.185 |
| 1515.0 | 0.186 |
| 1514.0 | 0.186 |
| 1513.0 | 0.187 |
| 1512.0 | 0.188 |
| 1511.0 | 0.189 |
| 1510.0 | 0.189 |
| 1509.0 | 0.19 |
| 1508.0 | 0.19 |
| 1507.0 | 0.19 |
| 1506.0 | 0.191 |
| 1505.0 | 0.191 |
| 1504.0 | 0.193 |
| 1503.0 | 0.194 |
| 1502.0 | 0.197 |
| 1501.0 | 0.199 |
| 1500.0 | 0.202 |
| 1499.0 | 0.205 |
| 1498.0 | 0.207 |
| 1497.0 | 0.209 |
| 1496.0 | 0.211 |
| 1495.0 | 0.212 |
| 1494.0 | 0.213 |
| 1493.0 | 0.213 |
| 1492.0 | 0.212 |
| 1491.0 | 0.212 |
| 1490.0 | 0.211 |
| 1489.0 | 0.211 |
| 1488.0 | 0.212 |
| 1487.0 | 0.214 |
| 1486.0 | 0.216 |
| 1485.0 | 0.22 |
| 1484.0 | 0.225 |
| 1483.0 | 0.231 |
| 1482.0 | 0.238 |
| 1481.0 | 0.244 |
| 1480.0 | 0.25 |
| 1479.0 | 0.256 |
| 1478.0 | 0.261 |
| 1477.0 | 0.264 |
| 1476.0 | 0.266 |
| 1475.0 | 0.266 |
| 1474.0 | 0.265 |
| 1473.0 | 0.263 |
| 1472.0 | 0.26 |
| 1471.0 | 0.256 |
| 1470.0 | 0.253 |
| 1469.0 | 0.25 |
| 1468.0 | 0.248 |
| 1467.0 | 0.248 |
| 1466.0 | 0.249 |
| 1465.0 | 0.251 |
| 1464.0 | 0.254 |
| 1463.0 | 0.258 |
| 1462.0 | 0.262 |
| 1461.0 | 0.267 |
| 1460.0 | 0.27 |
| 1459.0 | 0.273 |
| 1458.0 | 0.275 |
| 1457.0 | 0.275 |
| 1456.0 | 0.274 |
| 1455.0 | 0.272 |
| 1454.0 | 0.269 |
| 1453.0 | 0.266 |
| 1452.0 | 0.262 |
| 1451.0 | 0.258 |
| 1450.0 | 0.255 |
| 1449.0 | 0.252 |
| 1448.0 | 0.251 |
| 1447.0 | 0.25 |
| 1446.0 | 0.25 |
| 1445.0 | 0.251 |
| 1444.0 | 0.254 |
| 1443.0 | 0.256 |
| 1442.0 | 0.258 |
| 1441.0 | 0.26 |
| 1440.0 | 0.261 |
| 1439.0 | 0.262 |
| 1438.0 | 0.262 |
| 1437.0 | 0.262 |
| 1436.0 | 0.263 |
| 1435.0 | 0.263 |
| 1434.0 | 0.263 |
| 1433.0 | 0.264 |
| 1432.0 | 0.266 |
| 1431.0 | 0.268 |
| 1430.0 | 0.271 |
| 1429.0 | 0.274 |
| 1428.0 | 0.276 |
| 1427.0 | 0.279 |
| 1426.0 | 0.281 |
| 1425.0 | 0.281 |
| 1424.0 | 0.282 |
| 1423.0 | 0.282 |
| 1422.0 | 0.281 |
| 1421.0 | 0.281 |
| 1420.0 | 0.281 |
| 1419.0 | 0.281 |
| 1418.0 | 0.283 |
| 1417.0 | 0.286 |
| 1416.0 | 0.291 |
| 1415.0 | 0.296 |
| 1414.0 | 0.303 |
| 1413.0 | 0.311 |
| 1412.0 | 0.32 |
| 1411.0 | 0.327 |
| 1410.0 | 0.333 |
| 1409.0 | 0.337 |
| 1408.0 | 0.342 |
| 1407.0 | 0.344 |
| 1406.0 | 0.345 |
| 1405.0 | 0.343 |
| 1404.0 | 0.341 |
| 1403.0 | 0.338 |
| 1402.0 | 0.336 |
| 1401.0 | 0.333 |
| 1400.0 | 0.332 |
| 1399.0 | 0.336 |
| 1398.0 | 0.342 |
| 1397.0 | 0.347 |
| 1396.0 | 0.352 |
| 1395.0 | 0.36 |
| 1394.0 | 0.371 |
| 1393.0 | 0.379 |
| 1392.0 | 0.385 |
| 1391.0 | 0.39 |
| 1390.0 | 0.392 |
| 1389.0 | 0.391 |
| 1388.0 | 0.389 |
| 1387.0 | 0.386 |
| 1386.0 | 0.382 |
| 1385.0 | 0.377 |
| 1384.0 | 0.372 |
| 1383.0 | 0.367 |
| 1382.0 | 0.364 |
| 1381.0 | 0.364 |
| 1380.0 | 0.364 |
| 1379.0 | 0.363 |
| 1378.0 | 0.363 |
| 1377.0 | 0.362 |
| 1376.0 | 0.361 |
| 1375.0 | 0.36 |
| 1374.0 | 0.358 |
| 1373.0 | 0.356 |
| 1372.0 | 0.352 |
| 1371.0 | 0.349 |
| 1370.0 | 0.345 |
| 1369.0 | 0.342 |
| 1368.0 | 0.338 |
| 1367.0 | 0.335 |
| 1366.0 | 0.333 |
| 1365.0 | 0.331 |
| 1364.0 | 0.329 |
| 1363.0 | 0.329 |
| 1362.0 | 0.328 |
| 1361.0 | 0.327 |
| 1360.0 | 0.328 |
| 1359.0 | 0.328 |
| 1358.0 | 0.328 |
| 1357.0 | 0.328 |
| 1356.0 | 0.33 |
| 1355.0 | 0.332 |
| 1354.0 | 0.338 |
| 1353.0 | 0.344 |
| 1352.0 | 0.352 |
| 1351.0 | 0.359 |
| 1350.0 | 0.366 |
| 1349.0 | 0.373 |
| 1348.0 | 0.377 |
| 1347.0 | 0.38 |
| 1346.0 | 0.38 |
| 1345.0 | 0.378 |
| 1344.0 | 0.373 |
| 1343.0 | 0.367 |
| 1342.0 | 0.362 |
| 1341.0 | 0.357 |
| 1340.0 | 0.355 |
| 1339.0 | 0.355 |
| 1338.0 | 0.36 |
| 1337.0 | 0.368 |
| 1336.0 | 0.38 |
| 1335.0 | 0.393 |
| 1334.0 | 0.408 |
| 1333.0 | 0.423 |
| 1332.0 | 0.436 |
| 1331.0 | 0.447 |
| 1330.0 | 0.453 |
| 1329.0 | 0.456 |
| 1328.0 | 0.454 |
| 1327.0 | 0.449 |
| 1326.0 | 0.441 |
| 1325.0 | 0.43 |
| 1324.0 | 0.419 |
| 1323.0 | 0.408 |
| 1322.0 | 0.398 |
| 1321.0 | 0.392 |
| 1320.0 | 0.389 |
| 1319.0 | 0.389 |
| 1318.0 | 0.391 |
| 1317.0 | 0.394 |
| 1316.0 | 0.397 |
| 1315.0 | 0.4 |
| 1314.0 | 0.4 |
| 1313.0 | 0.397 |
| 1312.0 | 0.393 |
| 1311.0 | 0.387 |
| 1310.0 | 0.38 |
| 1309.0 | 0.372 |
| 1308.0 | 0.366 |
| 1307.0 | 0.36 |
| 1306.0 | 0.357 |
| 1305.0 | 0.356 |
| 1304.0 | 0.356 |
| 1303.0 | 0.358 |
| 1302.0 | 0.359 |
| 1301.0 | 0.361 |
| 1300.0 | 0.361 |
| 1299.0 | 0.361 |
| 1298.0 | 0.361 |
| 1297.0 | 0.361 |
| 1296.0 | 0.362 |
| 1295.0 | 0.365 |
| 1294.0 | 0.37 |
| 1293.0 | 0.378 |
| 1292.0 | 0.388 |
| 1291.0 | 0.4 |
| 1290.0 | 0.412 |
| 1289.0 | 0.425 |
| 1288.0 | 0.436 |
| 1287.0 | 0.446 |
| 1286.0 | 0.454 |
| 1285.0 | 0.46 |
| 1284.0 | 0.464 |
| 1283.0 | 0.466 |
| 1282.0 | 0.468 |
| 1281.0 | 0.47 |
| 1280.0 | 0.472 |
| 1279.0 | 0.474 |
| 1278.0 | 0.477 |
| 1277.0 | 0.48 |
| 1276.0 | 0.483 |
| 1275.0 | 0.485 |
| 1274.0 | 0.485 |
| 1273.0 | 0.484 |
| 1272.0 | 0.483 |
| 1271.0 | 0.48 |
| 1270.0 | 0.479 |
| 1269.0 | 0.48 |
| 1268.0 | 0.483 |
| 1267.0 | 0.489 |
| 1266.0 | 0.499 |
| 1265.0 | 0.51 |
| 1264.0 | 0.521 |
| 1263.0 | 0.531 |
| 1262.0 | 0.538 |
| 1261.0 | 0.541 |
| 1260.0 | 0.54 |
| 1259.0 | 0.533 |
| 1258.0 | 0.52 |
| 1257.0 | 0.505 |
| 1256.0 | 0.488 |
| 1255.0 | 0.471 |
| 1254.0 | 0.456 |
| 1253.0 | 0.446 |
| 1252.0 | 0.442 |
| 1251.0 | 0.444 |
| 1250.0 | 0.45 |
| 1249.0 | 0.458 |
| 1248.0 | 0.466 |
| 1247.0 | 0.472 |
| 1246.0 | 0.474 |
| 1245.0 | 0.47 |
| 1244.0 | 0.46 |
| 1243.0 | 0.446 |
| 1242.0 | 0.428 |
| 1241.0 | 0.41 |
| 1240.0 | 0.394 |
| 1239.0 | 0.382 |
| 1238.0 | 0.376 |
| 1237.0 | 0.376 |
| 1236.0 | 0.38 |
| 1235.0 | 0.385 |
| 1234.0 | 0.39 |
| 1233.0 | 0.392 |
| 1232.0 | 0.391 |
| 1231.0 | 0.386 |
| 1230.0 | 0.378 |
| 1229.0 | 0.37 |
| 1228.0 | 0.364 |
| 1227.0 | 0.362 |
| 1226.0 | 0.365 |
| 1225.0 | 0.373 |
| 1224.0 | 0.385 |
| 1223.0 | 0.397 |
| 1222.0 | 0.408 |
| 1221.0 | 0.416 |
| 1220.0 | 0.418 |
| 1219.0 | 0.416 |
| 1218.0 | 0.41 |
| 1217.0 | 0.401 |
| 1216.0 | 0.393 |
| 1215.0 | 0.388 |
| 1214.0 | 0.388 |
| 1213.0 | 0.394 |
| 1212.0 | 0.406 |
| 1211.0 | 0.422 |
| 1210.0 | 0.44 |
| 1209.0 | 0.455 |
| 1208.0 | 0.467 |
| 1207.0 | 0.473 |
| 1206.0 | 0.473 |
| 1205.0 | 0.466 |
| 1204.0 | 0.455 |
| 1203.0 | 0.441 |
| 1202.0 | 0.427 |
| 1201.0 | 0.417 |
| 1200.0 | 0.411 |
| 1199.0 | 0.41 |
| 1198.0 | 0.414 |
| 1197.0 | 0.418 |
| 1196.0 | 0.422 |
| 1195.0 | 0.422 |
| 1194.0 | 0.418 |
| 1193.0 | 0.409 |
| 1192.0 | 0.396 |
| 1191.0 | 0.383 |
| 1190.0 | 0.37 |
| 1189.0 | 0.361 |
| 1188.0 | 0.357 |
| 1187.0 | 0.359 |
| 1186.0 | 0.364 |
| 1185.0 | 0.372 |
| 1184.0 | 0.378 |
| 1183.0 | 0.382 |
| 1182.0 | 0.383 |
| 1181.0 | 0.381 |
| 1180.0 | 0.377 |
| 1179.0 | 0.373 |
| 1178.0 | 0.37 |
| 1177.0 | 0.371 |
| 1176.0 | 0.376 |
| 1175.0 | 0.384 |
| 1174.0 | 0.393 |
| 1173.0 | 0.403 |
| 1172.0 | 0.411 |
| 1171.0 | 0.418 |
| 1170.0 | 0.421 |
| 1169.0 | 0.422 |
| 1168.0 | 0.422 |
| 1167.0 | 0.422 |
| 1166.0 | 0.424 |
| 1165.0 | 0.428 |
| 1164.0 | 0.434 |
| 1163.0 | 0.442 |
| 1162.0 | 0.45 |
| 1161.0 | 0.456 |
| 1160.0 | 0.459 |
| 1159.0 | 0.459 |
| 1158.0 | 0.457 |
| 1157.0 | 0.453 |
| 1156.0 | 0.45 |
| 1155.0 | 0.447 |
| 1154.0 | 0.447 |
| 1153.0 | 0.448 |
| 1152.0 | 0.449 |
| 1151.0 | 0.45 |
| 1150.0 | 0.449 |
| 1149.0 | 0.444 |
| 1148.0 | 0.436 |
| 1147.0 | 0.425 |
| 1146.0 | 0.413 |
| 1145.0 | 0.401 |
| 1144.0 | 0.391 |
| 1143.0 | 0.383 |
| 1142.0 | 0.378 |
| 1141.0 | 0.373 |
| 1140.0 | 0.368 |
| 1139.0 | 0.362 |
| 1138.0 | 0.354 |
| 1137.0 | 0.345 |
| 1136.0 | 0.335 |
| 1135.0 | 0.327 |
| 1134.0 | 0.321 |
| 1133.0 | 0.32 |
| 1132.0 | 0.322 |
| 1131.0 | 0.325 |
| 1130.0 | 0.328 |
| 1129.0 | 0.329 |
| 1128.0 | 0.326 |
| 1127.0 | 0.32 |
| 1126.0 | 0.312 |
| 1125.0 | 0.305 |
| 1124.0 | 0.303 |
| 1123.0 | 0.307 |
| 1122.0 | 0.318 |
| 1121.0 | 0.335 |
| 1120.0 | 0.355 |
| 1119.0 | 0.372 |
| 1118.0 | 0.384 |
| 1117.0 | 0.389 |
| 1116.0 | 0.389 |
| 1115.0 | 0.387 |
| 1114.0 | 0.389 |
| 1113.0 | 0.399 |
| 1112.0 | 0.418 |
| 1111.0 | 0.444 |
| 1110.0 | 0.474 |
| 1109.0 | 0.501 |
| 1108.0 | 0.519 |
| 1107.0 | 0.526 |
| 1106.0 | 0.519 |
| 1105.0 | 0.501 |
| 1104.0 | 0.473 |
| 1103.0 | 0.444 |
| 1102.0 | 0.419 |
| 1101.0 | 0.407 |
| 1100.0 | 0.409 |
| 1099.0 | 0.423 |
| 1098.0 | 0.442 |
| 1097.0 | 0.46 |
| 1096.0 | 0.47 |
| 1095.0 | 0.469 |
| 1094.0 | 0.454 |
| 1093.0 | 0.43 |
| 1092.0 | 0.397 |
| 1091.0 | 0.365 |
| 1090.0 | 0.336 |
| 1089.0 | 0.318 |
| 1088.0 | 0.312 |
| 1087.0 | 0.315 |
| 1086.0 | 0.322 |
| 1085.0 | 0.328 |
| 1084.0 | 0.328 |
| 1083.0 | 0.32 |
| 1082.0 | 0.305 |
| 1081.0 | 0.285 |
| 1080.0 | 0.264 |
| 1079.0 | 0.244 |
| 1078.0 | 0.23 |
| 1077.0 | 0.221 |
| 1076.0 | 0.219 |
| 1075.0 | 0.222 |
| 1074.0 | 0.232 |
| 1073.0 | 0.246 |
| 1072.0 | 0.264 |
| 1071.0 | 0.281 |
| 1070.0 | 0.294 |
| 1069.0 | 0.299 |
| 1068.0 | 0.295 |
| 1067.0 | 0.283 |
| 1066.0 | 0.266 |
| 1065.0 | 0.251 |
| 1064.0 | 0.248 |
| 1063.0 | 0.259 |
| 1062.0 | 0.287 |
| 1061.0 | 0.322 |
| 1060.0 | 0.362 |
| 1059.0 | 0.387 |
| 1058.0 | 0.397 |
| 1057.0 | 0.388 |
| 1056.0 | 0.361 |
| 1055.0 | 0.325 |
| 1054.0 | 0.287 |
| 1053.0 | 0.264 |
| 1052.0 | 0.263 |
| 1051.0 | 0.282 |
| 1050.0 | 0.316 |
| 1049.0 | 0.349 |
| 1048.0 | 0.371 |
| 1047.0 | 0.371 |
| 1046.0 | 0.348 |
| 1045.0 | 0.304 |
| 1044.0 | 0.254 |
| 1043.0 | 0.207 |
| 1042.0 | 0.18 |
| 1041.0 | 0.177 |
| 1040.0 | 0.192 |
| 1039.0 | 0.212 |
| 1038.0 | 0.221 |
| 1037.0 | 0.213 |
| 1036.0 | 0.188 |
| 1035.0 | 0.16 |
| 1034.0 | 0.142 |
| 1033.0 | 0.147 |
| 1032.0 | 0.175 |
| 1031.0 | 0.216 |
| 1030.0 | 0.255 |
| 1029.0 | 0.275 |
| 1028.0 | 0.271 |
| 1027.0 | 0.246 |
| 1026.0 | 0.21 |
| 1025.0 | 0.186 |
| 1024.0 | 0.185 |
| 1023.0 | 0.21 |
| 1022.0 | 0.258 |
| 1021.0 | 0.306 |
| 1020.0 | 0.346 |
| 1019.0 | 0.363 |
| 1018.0 | 0.355 |
| 1017.0 | 0.327 |
| 1016.0 | 0.286 |
| 1015.0 | 0.248 |
| 1014.0 | 0.222 |
| 1013.0 | 0.217 |
| 1012.0 | 0.226 |
| 1011.0 | 0.241 |
| 1010.0 | 0.248 |
| 1009.0 | 0.24 |
| 1008.0 | 0.216 |
| 1007.0 | 0.18 |
| 1006.0 | 0.141 |
| 1005.0 | 0.112 |
| 1004.0 | 0.099 |
| 1003.0 | 0.1 |
| 1002.0 | 0.111 |
| 1001.0 | 0.122 |
| 1000.0 | 0.128 |
| 999.0 | 0.129 |
| 998.0 | 0.126 |
| 997.0 | 0.124 |
| 996.0 | 0.125 |
| 995.0 | 0.124 |
| 994.0 | 0.119 |
| 993.0 | 0.108 |
| 992.0 | 0.092 |
| 991.0 | 0.079 |
| 990.0 | 0.076 |
| 989.0 | 0.088 |
| 988.0 | 0.113 |
| 987.0 | 0.143 |
| 986.0 | 0.166 |
| 985.0 | 0.172 |
| 984.0 | 0.16 |
| 983.0 | 0.134 |
| 982.0 | 0.105 |
| 981.0 | 0.087 |
| 980.0 | 0.082 |
| 979.0 | 0.094 |
| 978.0 | 0.117 |
| 977.0 | 0.138 |
| 976.0 | 0.15 |
| 975.0 | 0.146 |
| 974.0 | 0.127 |
| 973.0 | 0.102 |
| 972.0 | 0.075 |
| 971.0 | 0.054 |
| 970.0 | 0.044 |
| 969.0 | 0.041 |
| 968.0 | 0.045 |
| 967.0 | 0.049 |
| 966.0 | 0.054 |
| 965.0 | 0.056 |
| 964.0 | 0.057 |
| 963.0 | 0.058 |
| 962.0 | 0.056 |
| 961.0 | 0.053 |
| 960.0 | 0.047 |
| 959.0 | 0.04 |
| 958.0 | 0.033 |
| 957.0 | 0.029 |
| 956.0 | 0.027 |
| 955.0 | 0.027 |
| 954.0 | 0.027 |
| 953.0 | 0.025 |
| 952.0 | 0.023 |
| 951.0 | 0.021 |
| 950.0 | 0.021 |
| 949.0 | 0.024 |
| 948.0 | 0.028 |
| 947.0 | 0.03 |
| 946.0 | 0.028 |
| 945.0 | 0.025 |
| 944.0 | 0.02 |
| 943.0 | 0.019 |
| 942.0 | 0.02 |
| 941.0 | 0.023 |
| 940.0 | 0.027 |
| 939.0 | 0.029 |
| 938.0 | 0.026 |
| 937.0 | 0.022 |
| 936.0 | 0.017 |
| 935.0 | 0.015 |
| 934.0 | 0.016 |
| 933.0 | 0.02 |
| 932.0 | 0.023 |
| 931.0 | 0.023 |
| 930.0 | 0.021 |
| 929.0 | 0.017 |
| 928.0 | 0.013 |
| 927.0 | 0.011 |
| 926.0 | 0.011 |
| 925.0 | 0.013 |
| 924.0 | 0.014 |
| 923.0 | 0.014 |
| 922.0 | 0.012 |
| 921.0 | 0.009 |
| 920.0 | 0.008 |
| 919.0 | 0.007 |
| 918.0 | 0.008 |
| 917.0 | 0.008 |
| 916.0 | 0.008 |
| 915.0 | 0.006 |
| 914.0 | 0.005 |
| 913.0 | 0.005 |
| 912.0 | 0.005 |
| 911.0 | 0.006 |
| 910.0 | 0.006 |
| 909.0 | 0.005 |
| 908.0 | 0.004 |
| 907.0 | 0.004 |
| 906.0 | 0.003 |
| 905.0 | 0.003 |
| 904.0 | 0.004 |
| 903.0 | 0.004 |
| 902.0 | 0.003 |
| 901.0 | 0.003 |
| 900.0 | 0.005 |
| 899.0 | 0.017 |
| 898.0 | 0.03 |
| 897.0 | 0.032 |
| 896.0 | 0.004 |
| 895.0 | 0.01 |
| 894.0 | 0.023 |
| 893.0 | 0.008 |
| 892.0 | 0.005 |
| 891.0 | 0.011 |
| 890.0 | 0.007 |
| 889.0 | 0.016 |
| 888.0 | 0.013 |
| 887.0 | 0.006 |
| 886.0 | 0.013 |
| 885.0 | 0.008 |
| 884.0 | 0.005 |
| 883.0 | 0.001 |
| 882.0 | 0.005 |
| 881.0 | 0.006 |
| 880.0 | 0.009 |
| 879.0 | 0.001 |
| 878.0 | 0.017 |
| 877.0 | 0.028 |
| 876.0 | 0.031 |
| 875.0 | 0.005 |
| 874.0 | 0.006 |
| 873.0 | 0.007 |
| 872.0 | 0.01 |
| 871.0 | 0.005 |
| 870.0 | 0.004 |
| 869.0 | 0.02 |
| 868.0 | 0.003 |
| 867.0 | 0.004 |
| 866.0 | 0.005 |
| 865.0 | 0.004 |
| 864.0 | 0.001 |
| 863.0 | 0.021 |
| 862.0 | 0.008 |
| 861.0 | 0.002 |
| 860.0 | 0.017 |
| 859.0 | 0.002 |
| 858.0 | 0.004 |
| 857.0 | 0.004 |
| 856.0 | 0.005 |
| 855.0 | 0.002 |
| 854.0 | 0 |
| 853.0 | 0.002 |
| 852.0 | 0 |
| 851.0 | 0.001 |
| 850.0 | 0.005 |
| 849.0 | 0.001 |
| 848.0 | 0.003 |
| 847.0 | 0.005 |
| 846.0 | 0.001 |
| 845.0 | 0.002 |
| 844.0 | 0.003 |
| 843.0 | 0.005 |
| 842.0 | 0.001 |
| 841.0 | 0.003 |
| 840.0 | 0.001 |
| 839.0 | 0.002 |
| 838.0 | 0.001 |
| 837.0 | 0.003 |
| 836.0 | 0.003 |
| 835.0 | 0.004 |
| 834.0 | 0.001 |
| 833.0 | 0.002 |
| 832.0 | 0.002 |
| 831.0 | 0.002 |
| 830.0 | 0.001 |
| 829.0 | 0.003 |
| 828.0 | 0.002 |
| 827.0 | 0.002 |
| 826.0 | 0.001 |
| 825.0 | 0 |
| 824.0 | 0.004 |
| 823.0 | 0.005 |
| 822.0 | 0.005 |
| 821.0 | 0.001 |
| 820.0 | 0.001 |
| 819.0 | 0 |
| 818.0 | 0 |
| 817.0 | 0.002 |
| 816.0 | 0.004 |
| 815.0 | 0.002 |
| 814.0 | 0.001 |
| 813.0 | 0.002 |
| 812.0 | 0.001 |
| 811.0 | 0.001 |
| 810.0 | 0.001 |
| 809.0 | 0.003 |
| 808.0 | 0.004 |
| 807.0 | 0.001 |
| 806.0 | 0.003 |
| 805.0 | 0.001 |
| 804.0 | 0 |
| 803.0 | 0.001 |
| 802.0 | 0.001 |
| 801.0 | 0.003 |
| 800.0 | 0 |
| 799.0 | 0 |
| 798.0 | 0.001 |
| 797.0 | 0.001 |
| 796.0 | 0 |
| 795.0 | 0 |
| 794.0 | 0.002 |
| 793.0 | 0 |
| 792.0 | 0.002 |
| 791.0 | 0 |
| 790.0 | 0 |
| 789.0 | 0.002 |
| 788.0 | 0.001 |
| 787.0 | 0.004 |
| 786.0 | 0.001 |
| 785.0 | 0.003 |
| 784.0 | 0.003 |
| 783.0 | 0.002 |
| 782.0 | 0.001 |
| 781.0 | 0.002 |
| 780.0 | 0.002 |
| 779.0 | 0.001 |
| 778.0 | 0.003 |
| 777.0 | 0.004 |
| 776.0 | 0.001 |
| 775.0 | 0.001 |
| 774.0 | 0.002 |
| 773.0 | 0.002 |
| 772.0 | 0.003 |
| 771.0 | 0.001 |
| 770.0 | 0.004 |
| 769.0 | 0.002 |
| 768.0 | 0.001 |
| 767.0 | 0.001 |
| 766.0 | 0.001 |
| 765.0 | 0 |
| 764.0 | 0.001 |
| 763.0 | 0.002 |
| 762.0 | 0 |
| 761.0 | 0.001 |
| 760.0 | 0.002 |
| 759.0 | 0.002 |
| 758.0 | 0 |
| 757.0 | 0.001 |
| 756.0 | 0.001 |
| 755.0 | 0.001 |
| 754.0 | 0.005 |
| 753.0 | 0.004 |
| 752.0 | 0.001 |
| 751.0 | 0.002 |
| 750.0 | 0.001 |
| 749.0 | 0.002 |
| 748.0 | 0.001 |
| 747.0 | 0.001 |
| 746.0 | 0.002 |
| 745.0 | 0.004 |
| 744.0 | 0.001 |
| 743.0 | 0 |
| 742.0 | 0.003 |
| 741.0 | 0.005 |
| 740.0 | 0.003 |
| 739.0 | 0 |
| 738.0 | 0.001 |
| 737.0 | 0.002 |
| 736.0 | 0.003 |
| 735.0 | 0.002 |
| 734.0 | 0.004 |
| 733.0 | 0.007 |
| 732.0 | 0.005 |
| 731.0 | 0.001 |
| 730.0 | 0.002 |
| 729.0 | 0.004 |
| 728.0 | 0.004 |
| 727.0 | 0.002 |
| 726.0 | 0.002 |
| 725.0 | 0.005 |
| 724.0 | 0.005 |
| 723.0 | 0.002 |
| 722.0 | 0.001 |
| 721.0 | 0.004 |
| 720.0 | 0.004 |
| 719.0 | 0.002 |
| 718.0 | 0.001 |
| 717.0 | 0.003 |
| 716.0 | 0.004 |
| 715.0 | 0.003 |
| 714.0 | 0.003 |
| 713.0 | 0.004 |
| 712.0 | 0.005 |
| 711.0 | 0.001 |
| 710.0 | 0.001 |
| 709.0 | 0.004 |
| 708.0 | 0.004 |
| 707.0 | 0.002 |
| 706.0 | 0.004 |
| 705.0 | 0.007 |
| 704.0 | 0.005 |
| 703.0 | 0.003 |
| 702.0 | 0.004 |
| 701.0 | 0.007 |
| 700.0 | 0.006 |
| 699.0 | 0.002 |
| 698.0 | 0.003 |
| 697.0 | 0.006 |
| 696.0 | 0.004 |
| 695.0 | 0.004 |
| 694.0 | 0.007 |
| 693.0 | 0.007 |
| 692.0 | 0.004 |
| 691.0 | 0.004 |
| 690.0 | 0.009 |
| 689.0 | 0.007 |
| 688.0 | 0.002 |
| 687.0 | 0.003 |
| 686.0 | 0.006 |
| 685.0 | 0.004 |
| 684.0 | 0.003 |
| 683.0 | 0.006 |
| 682.0 | 0.007 |
| 681.0 | 0.004 |
| 680.0 | 0.006 |
| 679.0 | 0.008 |
| 678.0 | 0.005 |
| 677.0 | 0.003 |
| 676.0 | 0.008 |
| 675.0 | 0.007 |
| 674.0 | 0.002 |
| 673.0 | 0.005 |
| 672.0 | 0.008 |
| 671.0 | 0.002 |
| 670.0 | 0.003 |
| 669.0 | 0.009 |
| 668.0 | 0.005 |
| 667.0 | 0.005 |
| 666.0 | 0.011 |
| 665.0 | 0.008 |
| 664.0 | 0.005 |
| 663.0 | 0.009 |
| 662.0 | 0.011 |
| 661.0 | 0.006 |
| 660.0 | 0.009 |
| 659.0 | 0.014 |
| 658.0 | 0.007 |
| 657.0 | 0.01 |
| 656.0 | 0.017 |
| 655.0 | 0.008 |
| 654.0 | 0.008 |
| 653.0 | 0.015 |
| 652.0 | 0.01 |
| 651.0 | 0.005 |
| 650.0 | 0.006 |
| 649.0 | 0.003 |
| 648.0 | 0.004 |
| 647.0 | 0.003 |
| 646.0 | 0.004 |
| 645.0 | 0.006 |
| 644.0 | 0.013 |
| 643.0 | 0.026 |
| 642.0 | 0.087 |
| 641.0 | 0.407 |
| 640.0 | 1.15 |
| 639.0 | 2.84 |
| 638.0 | 3.693 |
| 637.0 | 4.454 |
| 636.0 | 5.373 |
| 635.0 | 5.79 |
| 634.0 | 5.952 |
| 633.0 | 6.04 |
| 632.0 | 6.055 |
| 631.0 | 6.055 |
| 630.0 | 5.925 |
| 629.0 | 5.957 |
| 628.0 | 5.914 |
| 627.0 | 5.531 |
| 626.0 | 4.79 |
| 625.0 | 3.961 |
| 624.0 | 3.08 |
| 623.0 | 1.776 |
| 622.0 | 0.626 |
| 621.0 | 0.133 |
| 620.0 | 0.024 |
| 619.0 | 0.011 |
| 618.0 | 0.009 |
| 617.0 | 0.006 |
| 616.0 | 0.006 |
| 615.0 | 0.008 |
| 614.0 | 0.006 |
| 613.0 | 0.009 |
| 612.0 | 0.018 |
| 611.0 | 0.011 |
| 610.0 | 0.01 |
| 609.0 | 0.015 |
| 608.0 | 0.009 |
| 607.0 | 0.012 |
| 606.0 | 0.011 |
| 605.0 | 0.012 |
| 604.0 | 0.015 |
| 603.0 | 0.009 |
| 602.0 | 0.01 |
| 601.0 | 0.011 |
| 600.0 | 0.008 |
| 599.0 | 0.01 |
| 598.0 | 0.006 |
| 597.0 | 0.01 |
| 596.0 | 0.009 |
| 595.0 | 0.009 |
| 594.0 | 0.014 |
| 593.0 | 0.008 |
| 592.0 | 0.008 |
| 591.0 | 0.009 |
| 590.0 | 0.007 |
| 589.0 | 0.012 |
| 588.0 | 0.008 |
| 587.0 | 0.007 |
| 586.0 | 0.009 |
| 585.0 | 0.008 |
| 584.0 | 0.01 |
| 583.0 | 0.009 |
| 582.0 | 0.01 |
| 581.0 | 0.01 |
| 580.0 | 0.008 |
| 579.0 | 0.008 |
| 578.0 | 0.007 |
| 577.0 | 0.008 |
| 576.0 | 0.01 |
| 575.0 | 0.009 |
| 574.0 | 0.01 |
| 573.0 | 0.008 |
| 572.0 | 0.008 |
| 571.0 | 0.006 |
| 570.0 | 0.01 |
| 569.0 | 0.009 |
| 568.0 | 0.009 |
| 567.0 | 0.01 |
| 566.0 | 0.007 |
| 565.0 | 0.008 |
| 564.0 | 0.006 |
| 563.0 | 0.007 |
| 562.0 | 0.007 |
| 561.0 | 0.01 |
| 560.0 | 0.011 |
| 559.0 | 0.006 |
| 558.0 | 0.009 |
| 557.0 | 0.007 |
| 556.0 | 0.006 |
| 555.0 | 0.009 |
| 554.0 | 0.009 |
| 553.0 | 0.006 |
| 552.0 | 0.009 |
| 551.0 | 0.007 |
| 550.0 | 0.011 |
| 549.0 | 0.007 |
| 548.0 | 0.006 |
| 547.0 | 0.008 |
| 546.0 | 0.004 |
| 545.0 | 0.005 |
| 544.0 | 0.007 |
| 543.0 | 0.006 |
| 542.0 | 0.008 |
| 541.0 | 0.009 |
| 540.0 | 0.007 |
| 539.0 | 0.004 |
| 538.0 | 0.004 |
| 537.0 | 0.007 |
| 536.0 | 0.006 |
| 535.0 | 0.006 |
| 534.0 | 0.008 |
| 533.0 | 0.007 |
| 532.0 | 0.005 |
| 531.0 | 0.004 |
| 530.0 | 0.005 |
| 529.0 | 0.008 |
| 528.0 | 0.007 |
| 527.0 | 0.003 |
| 526.0 | 0.008 |
| 525.0 | 0.01 |
| 524.0 | 0.008 |
| 523.0 | 0.007 |
| 522.0 | 0.005 |
| 521.0 | 0.004 |
| 520.0 | 0.006 |
| 519.0 | 0.008 |
| 518.0 | 0.009 |
| 517.0 | 0.01 |
| 516.0 | 0.005 |
| 515.0 | 0.01 |
| 514.0 | 0.006 |
| 513.0 | 0.007 |
| 512.0 | 0.01 |
| 511.0 | 0.01 |
| 510.0 | 0.01 |
| 509.0 | 0.008 |
| 508.0 | 0.006 |
| 507.0 | 0.009 |
| 506.0 | 0.01 |
| 505.0 | 0.009 |
| 504.0 | 0.011 |
| 503.0 | 0.012 |
| 502.0 | 0.009 |
| 501.0 | 0.008 |
| 500.0 | 0.007 |
| 499.0 | 0.008 |
| 498.0 | 0.011 |
| 497.0 | 0.01 |
| 496.0 | 0.009 |
| 495.0 | 0.009 |
| 494.0 | 0.009 |
| 493.0 | 0.008 |
| 492.0 | 0.008 |
| 491.0 | 0.008 |
| 490.0 | 0.007 |
| 489.0 | 0.007 |
| 488.0 | 0.008 |
| 487.0 | 0.007 |
| 486.0 | 0.007 |
| 485.0 | 0.012 |
| 484.0 | 0.009 |
| 483.0 | 0.006 |
| 482.0 | 0.011 |
| 481.0 | 0.006 |
| 480.0 | 0.007 |
| 479.0 | 0.004 |
| 478.0 | 0.006 |
| 477.0 | 0.008 |
| 476.0 | 0.006 |
| 475.0 | 0.005 |
| 474.0 | 0.006 |
| 473.0 | 0.006 |
| 472.0 | 0.007 |
| 471.0 | 0.007 |
| 470.0 | 0.007 |
| 469.0 | 0.008 |
| 468.0 | 0.009 |
| 467.0 | 0.009 |
| 466.0 | 0.011 |
| 465.0 | 0.02 |
| 464.0 | 0.039 |
| 463.0 | 0.069 |
| 462.0 | 0.1 |
| 461.0 | 0.127 |
| 460.0 | 0.148 |
| 459.0 | 0.173 |
| 458.0 | 0.212 |
| 457.0 | 0.263 |
| 456.0 | 0.318 |
| 455.0 | 0.374 |
| 454.0 | 0.436 |
| 453.0 | 0.515 |
| 452.0 | 0.622 |
| 451.0 | 0.747 |
| 450.0 | 0.876 |
| 449.0 | 1.018 |
| 448.0 | 1.19 |
| 447.0 | 1.376 |
| 446.0 | 1.54 |
| 445.0 | 1.711 |
| 444.0 | 1.926 |
| 443.0 | 2.149 |
| 442.0 | 2.377 |
| 441.0 | 2.712 |
| 440.0 | 3.282 |
| 439.0 | 4.31 |
| 438.0 | 4.448 |
| 437.0 | 4.539 |
| 436.0 | 4.874 |
| 435.0 | 4.462 |
| 434.0 | 4.373 |
| 433.0 | 4.475 |
| 432.0 | 4.29 |
| 431.0 | 4.521 |
| 430.0 | 5.107 |
| 429.0 | 4.63 |
| 428.0 | 4.339 |
| 427.0 | 4.372 |
| 426.0 | 4.339 |
| 425.0 | 4.65 |
| 424.0 | 5.173 |
| 423.0 | 4.52 |
| 422.0 | 4.446 |
| 421.0 | 4.503 |
| 420.0 | 4.288 |
| 419.0 | 4.72 |
| 418.0 | 5.172 |
| 417.0 | 4.649 |
| 416.0 | 4.306 |
| 415.0 | 4.569 |
| 414.0 | 4.381 |
| 413.0 | 4.67 |
| 412.0 | 4.949 |
| 411.0 | 4.405 |
| 410.0 | 4.233 |
| 409.0 | 4.249 |
| 408.0 | 4.276 |
| 407.0 | 4.568 |
| 406.0 | 4.285 |
| 405.0 | 4.335 |
| 404.0 | 4.304 |
| 403.0 | 4.549 |
| 402.0 | 4.367 |
| 401.0 | 4.646 |
| 400.0 | 5.169 |
| 399.0 | 4.646 |
| 398.0 | 4.323 |
| 397.0 | 4.293 |
| 396.0 | 4.265 |
| 395.0 | 4.427 |
| 394.0 | 4.991 |
| 393.0 | 4.584 |
| 392.0 | 4.255 |
| 391.0 | 4.565 |
| 390.0 | 4.354 |
| 389.0 | 4.547 |
| 388.0 | 4.768 |
| 387.0 | 4.546 |
| 386.0 | 4.439 |
| 385.0 | 4.438 |
| 384.0 | 4.271 |
| 383.0 | 4.528 |
| 382.0 | 4.829 |
| 381.0 | 4.375 |
| 380.0 | 4.261 |
| 379.0 | 4.261 |
| 378.0 | 4.217 |
| 377.0 | 4.494 |
| 376.0 | 4.373 |
| 375.0 | 4.94 |
| 374.0 | 4.493 |
| 373.0 | 4.794 |
| 372.0 | 5.162 |
| 371.0 | 4.597 |
| 370.0 | 4.316 |
| 369.0 | 4.337 |
| 368.0 | 4.407 |
| 367.0 | 4.897 |
| 366.0 | 5.636 |
| 365.0 | 4.523 |
| 364.0 | 4.406 |
| 363.0 | 4.707 |
| 362.0 | 4.381 |
| 361.0 | 4.636 |
| 360.0 | 5.238 |
| 359.0 | 4.475 |
| 358.0 | 4.313 |
| 357.0 | 4.313 |
| 356.0 | 4.431 |
| 355.0 | 4.706 |
| 354.0 | 5.458 |
| 353.0 | 4.379 |
| 352.0 | 4.367 |
| 351.0 | 4.504 |
| 350.0 | 4.391 |
| 349.0 | 4.593 |
| 348.0 | 5.157 |
| 347.0 | 4.322 |
| 346.0 | 4.39 |
| 345.0 | 4.572 |
| 344.0 | 4.415 |
| 343.0 | 4.502 |
| 342.0 | 5.332 |
| 341.0 | 4.331 |
| 340.0 | 4.261 |
| 339.0 | 4.376 |
| 338.0 | 4.353 |
| 337.0 | 4.59 |
| 336.0 | 5.932 |
| 335.0 | 4.309 |
| 334.0 | 4.199 |
| 333.0 | 4.5 |
| 332.0 | 4.363 |
| 331.0 | 4.589 |
| 330.0 | 5.028 |
| 329.0 | 4.34 |
| 328.0 | 4.231 |
| 327.0 | 4.231 |
| 326.0 | 4.35 |
| 325.0 | 4.726 |
| 324.0 | 5.328 |
| 323.0 | 4.267 |
| 322.0 | 4.197 |
| 321.0 | 4.23 |
| 320.0 | 4.285 |
| 319.0 | 5.327 |
| 318.0 | 4.283 |
| 317.0 | 4.292 |
| 316.0 | 4.235 |
| 315.0 | 4.971 |
| 314.0 | 4.478 |
| 313.0 | 5.447 |
| 312.0 | 5.021 |
| 311.0 | 4.447 |
| 310.0 | 4.333 |
| 309.0 | 5.225 |
| 308.0 | 4.332 |
| 307.0 | 4.923 |
| 306.0 | 5.924 |
| 305.0 | 4.366 |
| 304.0 | 4.404 |
| 303.0 | 4.718 |
| 302.0 | 4.475 |
| 301.0 | 5.223 |
| 300.0 | 5.319 |
| 299.0 | 4.308 |
| 298.0 | 4.267 |
| 297.0 | 4.744 |
| 296.0 | 4.429 |
| 295.0 | 4.774 |
| 294.0 | 5.317 |
| 293.0 | 4.203 |
| 292.0 | 4.317 |
| 291.0 | 4.275 |
| 290.0 | 4.387 |
| 289.0 | 4.596 |
| 288.0 | 5.441 |
| 287.0 | 4.193 |
| 286.0 | 4.274 |
| 285.0 | 4.537 |
| 284.0 | 4.373 |
| 283.0 | 4.875 |
| 282.0 | 5.218 |
| 281.0 | 4.235 |
| 280.0 | 4.313 |
| 279.0 | 4.302 |
| 278.0 | 4.371 |
| 277.0 | 5.312 |
| 276.0 | 5.914 |
| 275.0 | 4.302 |
| 274.0 | 4.301 |
| 273.0 | 4.738 |
| 272.0 | 4.323 |
| 271.0 | 5.312 |
| 270.0 | 4.872 |
| 269.0 | 4.422 |
| 268.0 | 4.241 |
| 267.0 | 4.482 |
| 266.0 | 4.834 |
| 265.0 | 5.311 |
| 264.0 | 4.799 |
| 263.0 | 4.214 |
| 262.0 | 4.259 |
| 261.0 | 4.31 |
| 260.0 | 4.213 |
| 259.0 | 5.213 |
| 258.0 | 4.531 |
| 257.0 | 4.331 |
| 256.0 | 4.287 |
| 255.0 | 4.568 |
| 254.0 | 4.276 |
| 253.0 | 5.307 |
| 252.0 | 4.608 |
| 251.0 | 4.377 |
| 250.0 | 4.192 |
| 249.0 | 4.829 |
| 248.0 | 4.192 |
| 247.0 | 5.004 |
| 246.0 | 4.629 |
| 245.0 | 4.389 |
| 244.0 | 4.143 |
| 243.0 | 4.628 |
| 242.0 | 4.273 |
| 241.0 | 4.545 |
| 240.0 | 4.545 |
| 239.0 | 4.388 |
| 238.0 | 4.182 |
| 237.0 | 4.402 |
| 236.0 | 4.235 |
| 235.0 | 4.866 |
| 234.0 | 4.731 |
| 233.0 | 4.182 |
| 232.0 | 4.244 |
| 231.0 | 4.584 |
| 230.0 | 4.243 |
| 229.0 | 5.206 |
| 228.0 | 4.825 |
| 227.0 | 4.27 |
| 226.0 | 4.213 |
| 225.0 | 4.289 |
| 224.0 | 4.322 |
| 223.0 | 4.725 |
| 222.0 | 4.724 |
| 221.0 | 4.246 |
| 220.0 | 4.182 |
| 219.0 | 4.536 |
| 218.0 | 4.284 |
| 217.0 | 4.816 |
| 216.0 | 4.94 |
| 215.0 | 4.146 |
| 214.0 | 4.25 |
| 213.0 | 4.43 |
| 212.0 | 4.268 |
| 211.0 | 4.46 |
| 210.0 | 4.548 |
| 209.0 | 4.173 |
| 208.0 | 4.225 |
| 207.0 | 4.369 |
| 206.0 | 4.253 |
| 205.0 | 4.394 |
| 204.0 | 4.563 |
| 203.0 | 4.072 |
| 202.0 | 4.098 |
| 201.0 | 4.167 |
| 200.0 | 4.019 |